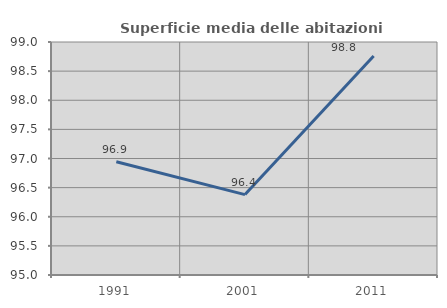
| Category | Superficie media delle abitazioni occupate |
|---|---|
| 1991.0 | 96.943 |
| 2001.0 | 96.38 |
| 2011.0 | 98.761 |